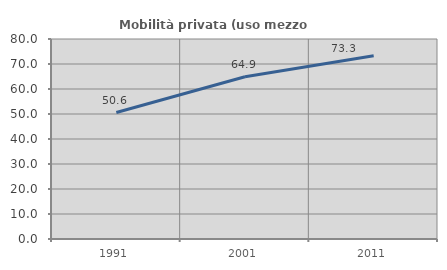
| Category | Mobilità privata (uso mezzo privato) |
|---|---|
| 1991.0 | 50.6 |
| 2001.0 | 64.875 |
| 2011.0 | 73.295 |